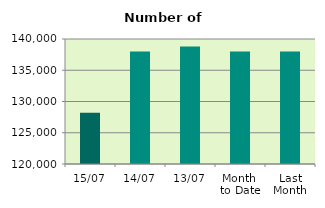
| Category | Series 0 |
|---|---|
| 15/07 | 128200 |
| 14/07 | 138014 |
| 13/07 | 138812 |
| Month 
to Date | 138000.182 |
| Last
Month | 138016.909 |